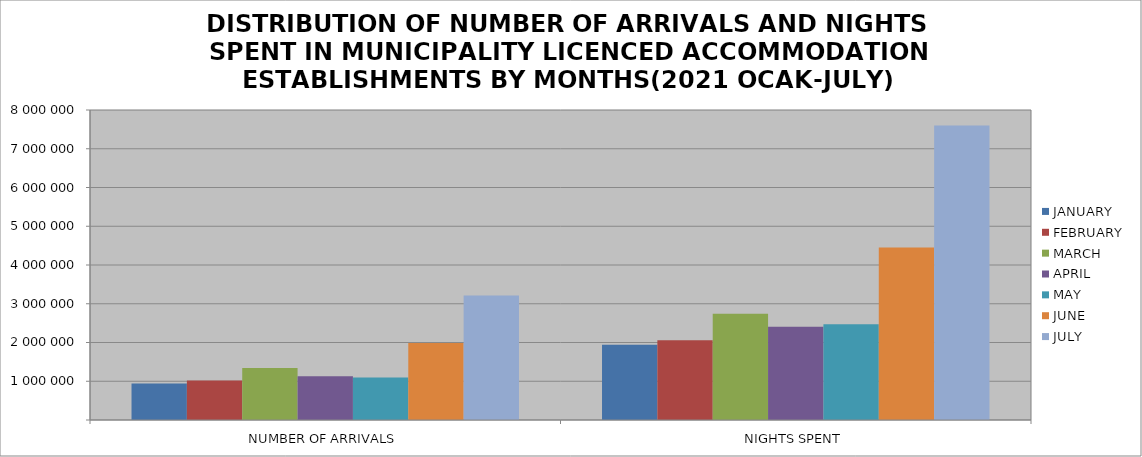
| Category | JANUARY | FEBRUARY | MARCH | APRIL | MAY | JUNE | JULY |
|---|---|---|---|---|---|---|---|
| NUMBER OF ARRIVALS | 940331 | 1017199 | 1342202 | 1131069 | 1098456 | 1989433 | 3215014 |
| NIGHTS SPENT | 1943007 | 2056594 | 2743257 | 2406723 | 2471826 | 4450821 | 7597288 |